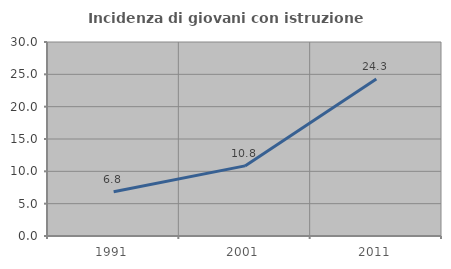
| Category | Incidenza di giovani con istruzione universitaria |
|---|---|
| 1991.0 | 6.849 |
| 2001.0 | 10.843 |
| 2011.0 | 24.286 |